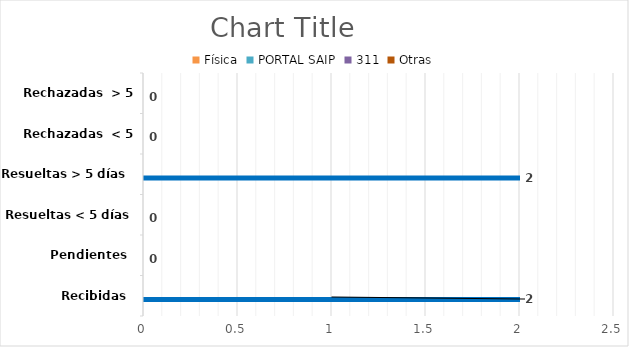
| Category | Física | PORTAL SAIP | 311 | Otras |
|---|---|---|---|---|
| Recibidas  | 0 | 2 | 0 | 0 |
| Pendientes  | 0 | 0 | 0 | 0 |
| Resueltas < 5 días | 0 | 0 | 0 | 0 |
| Resueltas > 5 días  | 0 | 2 | 0 | 0 |
| Rechazadas  < 5 días | 0 | 0 | 0 | 0 |
| Rechazadas  > 5 días | 0 | 0 | 0 | 0 |